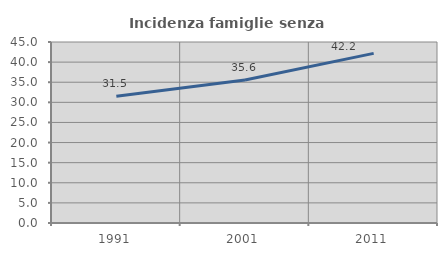
| Category | Incidenza famiglie senza nuclei |
|---|---|
| 1991.0 | 31.514 |
| 2001.0 | 35.564 |
| 2011.0 | 42.179 |